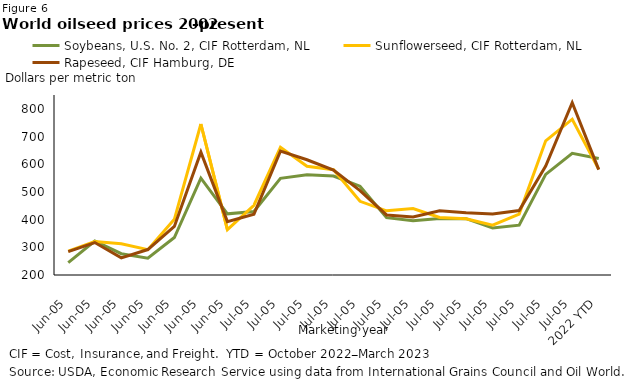
| Category | Soybeans, U.S. No. 2, CIF Rotterdam, NL | Sunflowerseed, CIF Rotterdam, NL | Rapeseed, CIF Hamburg, DE |
|---|---|---|---|
| 2002 | 244.833 | 286.167 | 284.583 |
| 2003 | 322.75 | 320.75 | 317.25 |
| 2004 | 276.917 | 313 | 261.917 |
| 2005 | 260.917 | 291.417 | 291.917 |
| 2006 | 335.417 | 401.167 | 375.167 |
| 2007 | 549.667 | 745.25 | 643.583 |
| 2008 | 420.833 | 363.667 | 392.833 |
| 2009 | 429.167 | 451.917 | 419.25 |
| 2010 | 549.25 | 661.167 | 647.25 |
| 2011 | 562.25 | 592.583 | 616.083 |
| 2012 | 557.167 | 580.25 | 578.5 |
| 2013 | 520.667 | 466.083 | 504.5 |
| 2014 | 407.083 | 431.667 | 416.833 |
| 2015 | 395.75 | 439.75 | 409.417 |
| 2016 | 403.583 | 407.583 | 431.583 |
| 2017 | 403.417 | 402.75 | 424.667 |
| 2018 | 369.917 | 380.083 | 419.917 |
| 2019 | 379.833 | 420 | 432.75 |
| 2020 | 563.25 | 684.667 | 593.667 |
| 2021 | 639.667 | 762.583 | 822.083 |
| 2022 YTD | 621 | 581.286 | 580.571 |